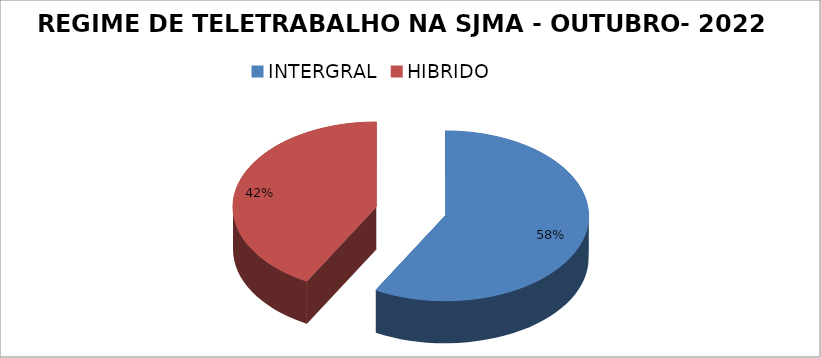
| Category | Series 0 |
|---|---|
| INTERGRAL | 83 |
| HIBRIDO | 60 |